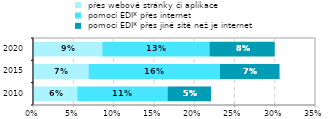
| Category |  přes webové stránky či aplikace |  pomocí EDI* přes internet |  pomocí EDI* přes jiné sítě než je internet |
|---|---|---|---|
| 2010.0 | 0.055 | 0.112 | 0.054 |
| 2015.0 | 0.069 | 0.163 | 0.074 |
| 2020.0 | 0.086 | 0.133 | 0.081 |